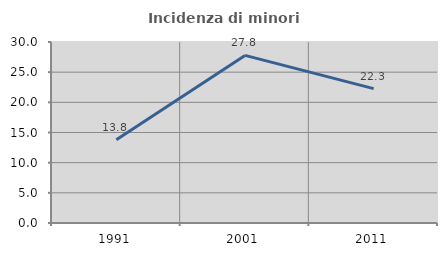
| Category | Incidenza di minori stranieri |
|---|---|
| 1991.0 | 13.793 |
| 2001.0 | 27.778 |
| 2011.0 | 22.271 |